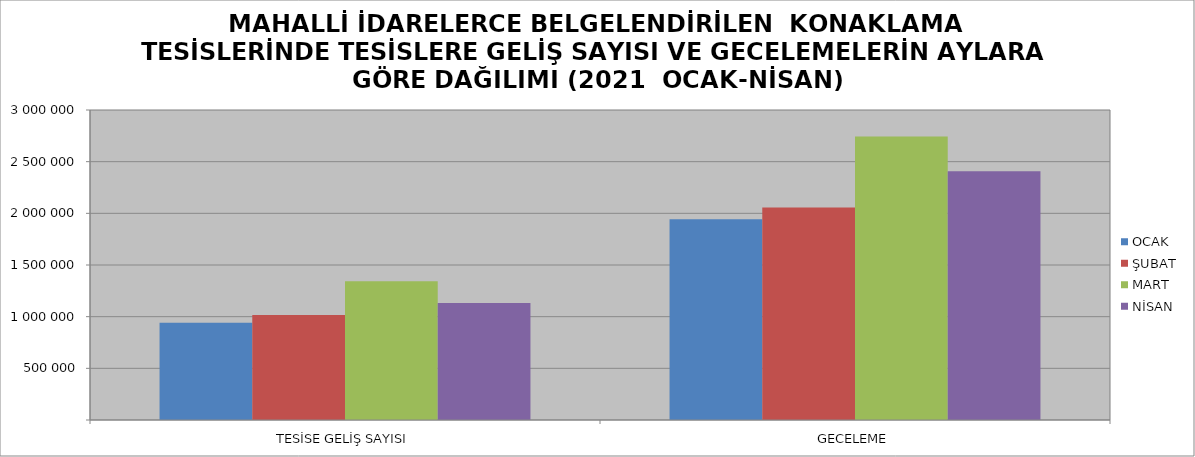
| Category | OCAK | ŞUBAT | MART | NİSAN |
|---|---|---|---|---|
| TESİSE GELİŞ SAYISI | 940331 | 1017199 | 1342202 | 1131069 |
| GECELEME | 1943007 | 2056594 | 2743257 | 2406723 |